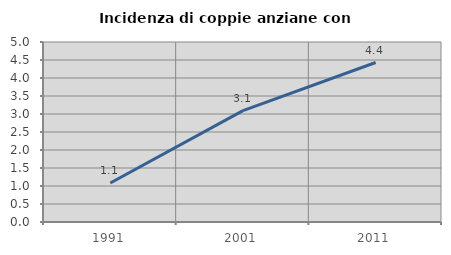
| Category | Incidenza di coppie anziane con figli |
|---|---|
| 1991.0 | 1.085 |
| 2001.0 | 3.094 |
| 2011.0 | 4.43 |